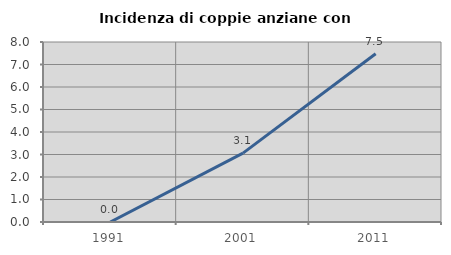
| Category | Incidenza di coppie anziane con figli |
|---|---|
| 1991.0 | 0 |
| 2001.0 | 3.061 |
| 2011.0 | 7.477 |